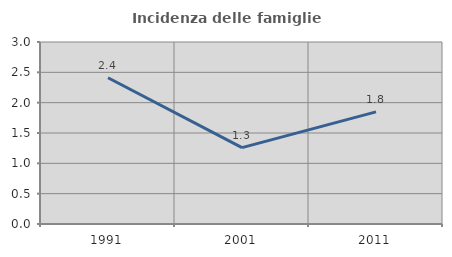
| Category | Incidenza delle famiglie numerose |
|---|---|
| 1991.0 | 2.41 |
| 2001.0 | 1.26 |
| 2011.0 | 1.848 |